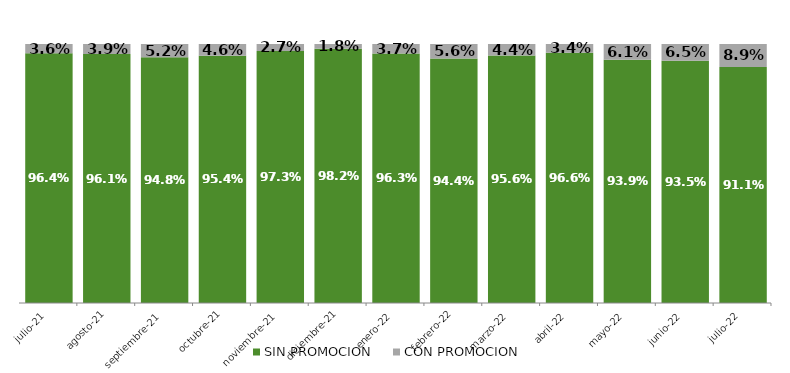
| Category | SIN PROMOCION   | CON PROMOCION   |
|---|---|---|
| 2021-07-01 | 0.964 | 0.036 |
| 2021-08-01 | 0.961 | 0.039 |
| 2021-09-01 | 0.948 | 0.052 |
| 2021-10-01 | 0.954 | 0.046 |
| 2021-11-01 | 0.973 | 0.027 |
| 2021-12-01 | 0.982 | 0.018 |
| 2022-01-01 | 0.963 | 0.037 |
| 2022-02-01 | 0.944 | 0.056 |
| 2022-03-01 | 0.956 | 0.044 |
| 2022-04-01 | 0.966 | 0.034 |
| 2022-05-01 | 0.939 | 0.061 |
| 2022-06-01 | 0.935 | 0.065 |
| 2022-07-01 | 0.911 | 0.089 |